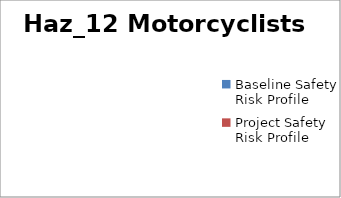
| Category | Haz_12 Motorcyclists | Haz_16 Maintenance | Haz_18 Pedestrians / Cyclists |
|---|---|---|---|
| Baseline Safety Risk Profile | 0 | 0 | 0 |
| Project Safety Risk Profile | 0 | 0 | 0 |